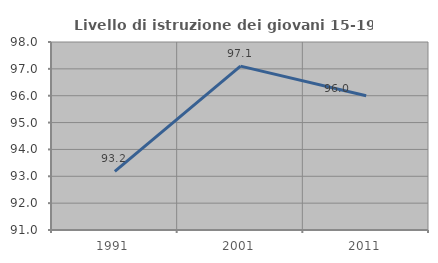
| Category | Livello di istruzione dei giovani 15-19 anni |
|---|---|
| 1991.0 | 93.182 |
| 2001.0 | 97.101 |
| 2011.0 | 96 |